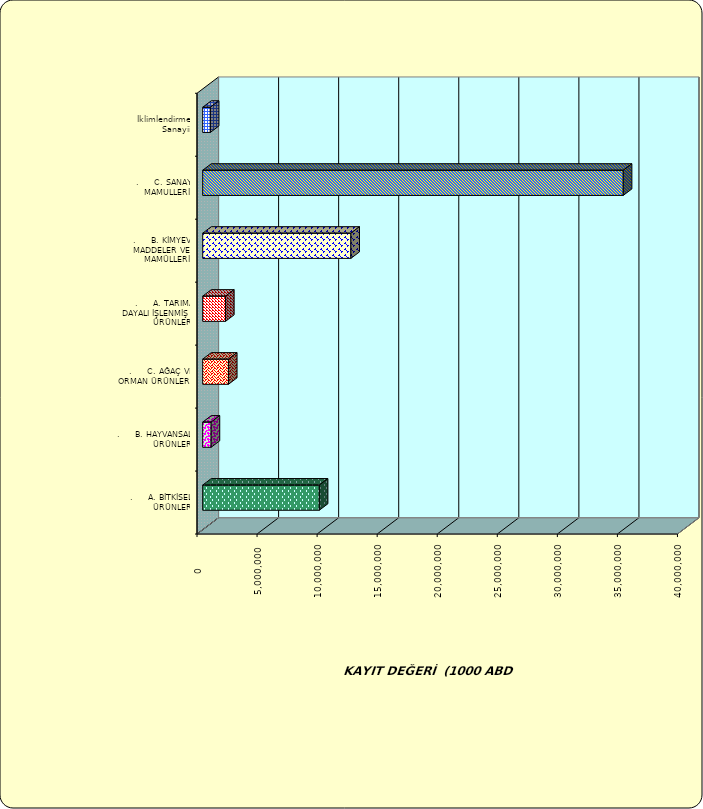
| Category | Series 0 |
|---|---|
| .     A. BİTKİSEL ÜRÜNLER | 9708197.831 |
| .     B. HAYVANSAL ÜRÜNLER | 702275.131 |
| .     C. AĞAÇ VE ORMAN ÜRÜNLERİ | 2143804.926 |
| .     A. TARIMA DAYALI İŞLENMİŞ ÜRÜNLER | 1901798.039 |
| .     B. KİMYEVİ MADDELER VE MAMÜLLERİ | 12337047.997 |
| .     C. SANAYİ MAMULLERİ | 35013796.504 |
|  İklimlendirme Sanayii | 635584.178 |